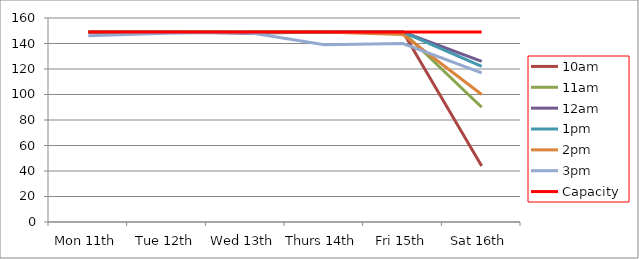
| Category | 9am | 10am | 11am | 12am | 1pm | 2pm | 3pm | 4pm | 5pm | Capacity |
|---|---|---|---|---|---|---|---|---|---|---|
| Mon 11th |  | 149 | 149 | 149 | 149 | 149 | 146 |  |  | 149 |
| Tue 12th |  | 149 | 149 | 149 | 149 | 149 | 148 |  |  | 149 |
| Wed 13th |  | 149 | 149 | 148 | 149 | 149 | 149 |  |  | 149 |
| Thurs 14th |  | 149 | 149 | 149 | 149 | 149 | 139 |  |  | 149 |
| Fri 15th |  | 149 | 149 | 149 | 149 | 147 | 140 |  |  | 149 |
| Sat 16th |  | 44 | 90 | 126 | 122 | 100 | 117 |  |  | 149 |